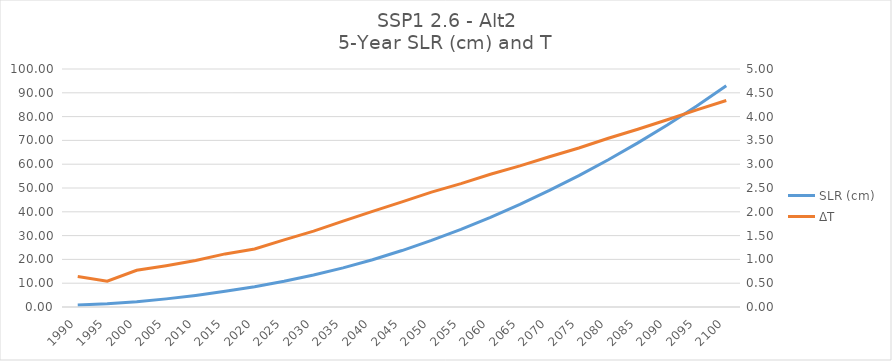
| Category | SLR (cm) |
|---|---|
| 1990.0 | 0.851 |
| 1995.0 | 1.315 |
| 2000.0 | 2.215 |
| 2005.0 | 3.412 |
| 2010.0 | 4.865 |
| 2015.0 | 6.592 |
| 2020.0 | 8.518 |
| 2025.0 | 10.794 |
| 2030.0 | 13.413 |
| 2035.0 | 16.439 |
| 2040.0 | 19.874 |
| 2045.0 | 23.719 |
| 2050.0 | 27.994 |
| 2055.0 | 32.641 |
| 2060.0 | 37.702 |
| 2065.0 | 43.132 |
| 2070.0 | 48.972 |
| 2075.0 | 55.201 |
| 2080.0 | 61.878 |
| 2085.0 | 68.965 |
| 2090.0 | 76.492 |
| 2095.0 | 84.488 |
| 2100.0 | 92.92 |